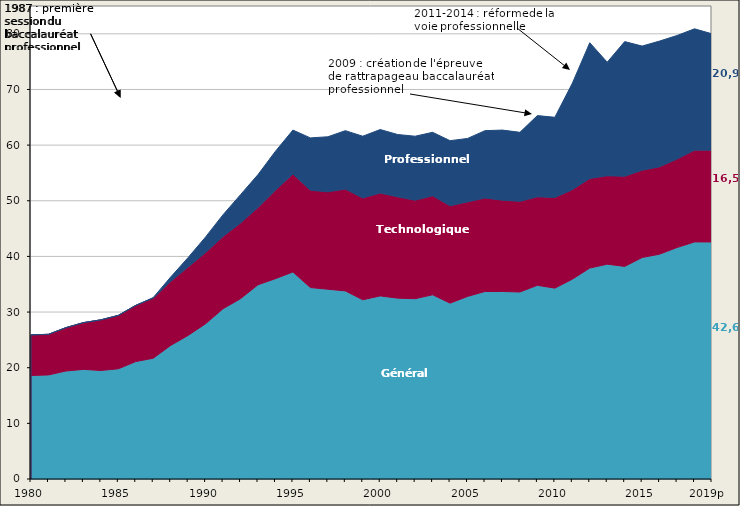
| Category | Général | Technologique | Professionnel |
|---|---|---|---|
| 1980 | 18.6 | 7.3 | 0 |
| 1981 | 18.7 | 7.3 | 0 |
| 1982 | 19.4 | 7.8 | 0 |
| 1983 | 19.7 | 8.4 | 0 |
| 1984 | 19.5 | 9.1 | 0 |
| 1985 | 19.8 | 9.6 | 0 |
| 1986 | 21.1 | 10.1 | 0 |
| 1987 | 21.7 | 10.8 | 0.1 |
| 1988 | 24 | 11.5 | 0.8 |
| 1989 | 25.8 | 12.3 | 1.7 |
| 1990 | 27.9 | 12.8 | 2.8 |
| 1991 | 30.6 | 13 | 3.9 |
| 1992 | 32.4 | 13.6 | 5.1 |
| 1993 | 34.9 | 13.9 | 5.9 |
| 1994 | 36 | 15.9 | 7 |
| 1995 | 37.2 | 17.6 | 7.9 |
| 1996 | 34.4 | 17.5 | 9.4 |
| 1997 | 34.1 | 17.5 | 9.9 |
| 1998 | 33.8 | 18.3 | 10.5 |
| 1999 | 32.2 | 18.3 | 11.1 |
| 2000 | 32.9 | 18.5 | 11.4 |
| 2001 | 32.5 | 18.2 | 11.2 |
| 2002 | 32.4 | 17.7 | 11.5 |
| 2003 | 33.1 | 17.8 | 11.4 |
| 2004 | 31.6 | 17.5 | 11.7 |
| 2005 | 32.8 | 17 | 11.4 |
| 2006 | 33.7 | 16.8 | 12.1 |
| 2007 | 33.7 | 16.4 | 12.6 |
| 2008 | 33.6 | 16.3 | 12.4 |
| 2009 | 34.8 | 15.9 | 14.6 |
| 2010 | 34.3 | 16.3 | 14.4 |
| 2011 | 35.9 | 16.1 | 19.1 |
| 2012 | 37.9 | 16.1 | 24.4 |
| 2013 | 38.6 | 15.9 | 20.4 |
| 2014 | 38.2 | 16.2 | 24.2 |
| 2015 | 39.8 | 15.7 | 22.3 |
| 2016 | 40.4 | 15.7 | 22.6 |
| 2017 | 41.6 | 15.9 | 22.2 |
| 2018p | 42.6 | 16.5 | 21.8 |
| 2019p | 42.6 | 16.5 | 20.9 |